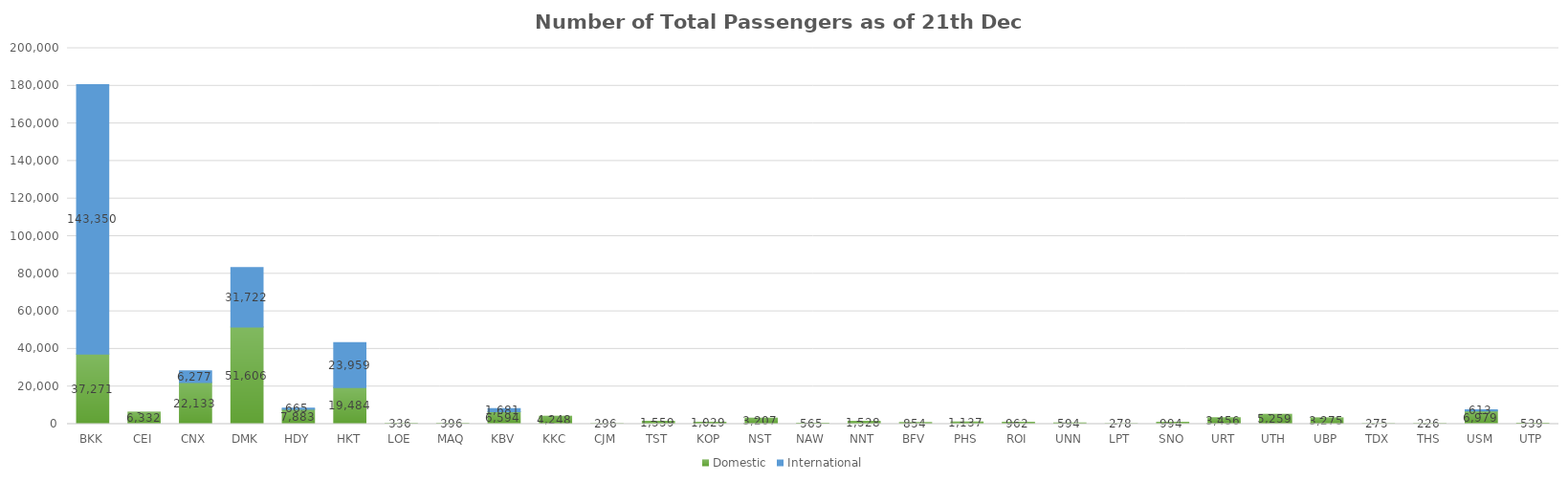
| Category | Domestic | International |
|---|---|---|
| BKK | 37271 | 143350 |
| CEI | 6332 | 0 |
| CNX | 22133 | 6277 |
| DMK | 51606 | 31722 |
| HDY | 7883 | 665 |
| HKT | 19484 | 23959 |
| LOE | 336 | 0 |
| MAQ | 396 | 0 |
| KBV | 6594 | 1681 |
| KKC | 4248 | 0 |
| CJM | 296 | 0 |
| TST | 1559 | 0 |
| KOP | 1029 | 0 |
| NST | 3207 | 0 |
| NAW | 565 | 0 |
| NNT | 1528 | 0 |
| BFV | 854 | 0 |
| PHS | 1137 | 0 |
| ROI | 962 | 0 |
| UNN | 594 | 0 |
| LPT | 278 | 0 |
| SNO | 994 | 0 |
| URT | 3456 | 0 |
| UTH | 5259 | 0 |
| UBP | 3275 | 0 |
| TDX | 275 | 0 |
| THS | 226 | 0 |
| USM | 6979 | 613 |
| UTP | 539 | 0 |